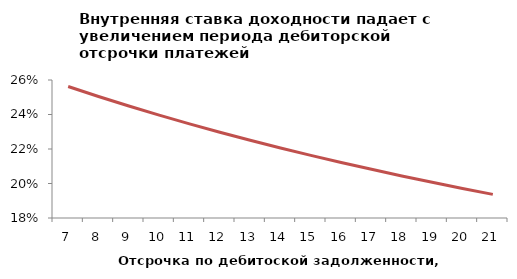
| Category | Series 1 |
|---|---|
| 7.0 | 0.256 |
| 8.0 | 0.25 |
| 9.0 | 0.245 |
| 10.0 | 0.24 |
| 11.0 | 0.235 |
| 12.0 | 0.23 |
| 13.0 | 0.225 |
| 14.0 | 0.221 |
| 15.0 | 0.216 |
| 16.0 | 0.212 |
| 17.0 | 0.208 |
| 18.0 | 0.204 |
| 19.0 | 0.201 |
| 20.0 | 0.197 |
| 21.0 | 0.194 |